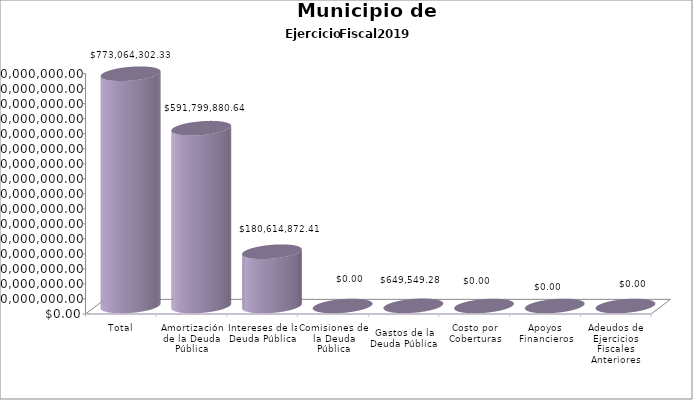
| Category | Municipio de Guadalajara
Deuda Pública 2019 |
|---|---|
| Total | 773064302.33 |
| Amortización de la Deuda Pública | 591799880.64 |
| Intereses de la Deuda Pública | 180614872.41 |
| Comisiones de la Deuda Pública | 0 |
| Gastos de la Deuda Pública | 649549.28 |
| Costo por Coberturas | 0 |
| Apoyos Financieros | 0 |
| Adeudos de Ejercicios Fiscales Anteriores (ADEFAS) | 0 |